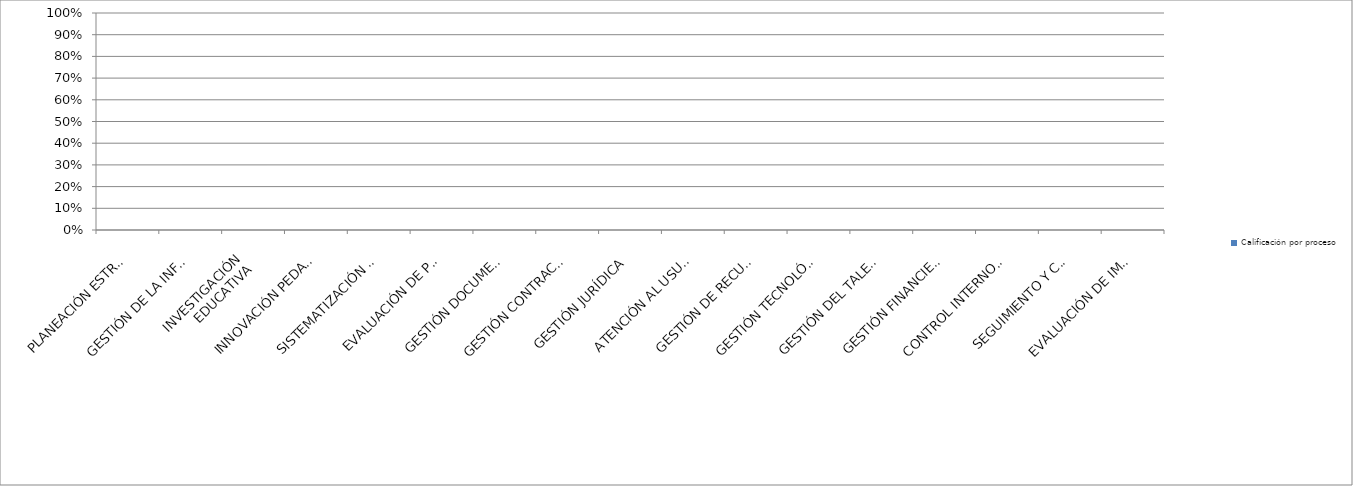
| Category | PROCESO | Calificación por proceso |
|---|---|---|
| PLANEACIÓN ESTRATÉGICA | 0 | 0 |
| GESTIÓN DE LA INFORMACIÓN Y LA COMUNICACIÓN INSTITUCIONAL | 0 | 0 |
| INVESTIGACIÓN
EDUCATIVA | 0 | 0 |
| INNOVACIÓN PEDAGÓGICA | 0 | 0 |
| SISTEMATIZACIÓN DE EXPERIENCIAS DE LAS Y LOS DOCENTES DEL DISTRITO | 0 | 0 |
| EVALUACIÓN DE POLÍTICAS PÚBLICAS EDUCATIVAS DISTRITALES | 0 | 0 |
| GESTIÓN DOCUMENTAL | 0 | 0 |
| GESTIÓN CONTRACTUAL | 0 | 0 |
| GESTIÓN JURÍDICA | 0 | 0 |
| ATENCIÓN AL USUARIO | 0 | 0 |
| GESTIÓN DE RECURSOS FÍSICOS | 0 | 0 |
| GESTIÓN TECNOLÓGICA | 0 | 0 |
| GESTIÓN DEL TALENTO HUMANO | 0 | 0 |
| GESTIÓN FINANCIERA | 0 | 0 |
| CONTROL INTERNO DISCIPLINARIO | 0 | 0 |
| SEGUIMIENTO Y CONTROL | 0 | 0 |
| EVALUACIÓN DE IMPACTOS | 0 | 0 |